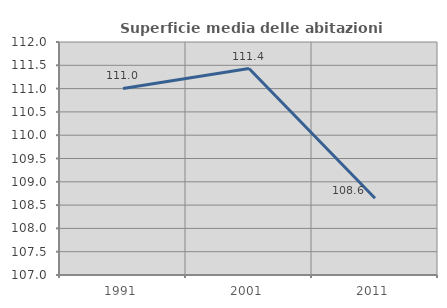
| Category | Superficie media delle abitazioni occupate |
|---|---|
| 1991.0 | 111.003 |
| 2001.0 | 111.431 |
| 2011.0 | 108.647 |